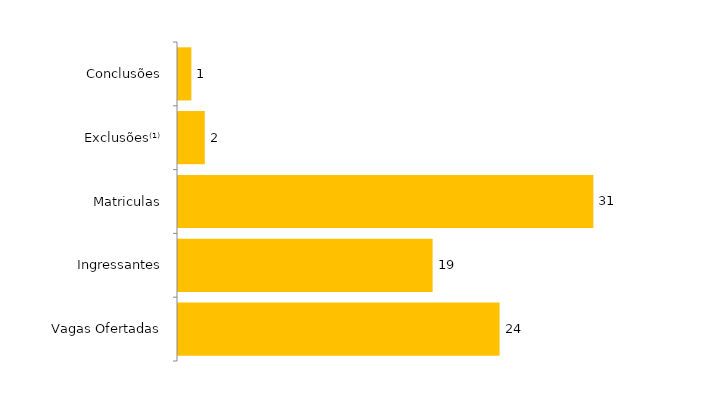
| Category | Total (2011) |
|---|---|
| Vagas Ofertadas | 24 |
| Ingressantes | 19 |
| Matriculas | 31 |
| Exclusões⁽¹⁾ | 2 |
| Conclusões | 1 |